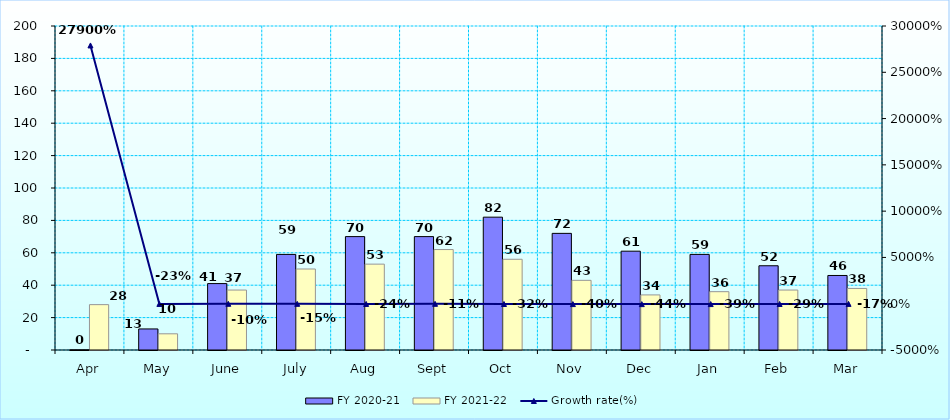
| Category | FY 2020-21 | FY 2021-22 |
|---|---|---|
| Apr | 0.1 | 28 |
| May | 13 | 10 |
| June | 41 | 37 |
| July | 59 | 50 |
| Aug | 70 | 53 |
| Sept | 70 | 62 |
| Oct | 82 | 56 |
| Nov | 72 | 43 |
| Dec | 61 | 34 |
| Jan | 59 | 36 |
| Feb | 52 | 37 |
| Mar | 46 | 38 |